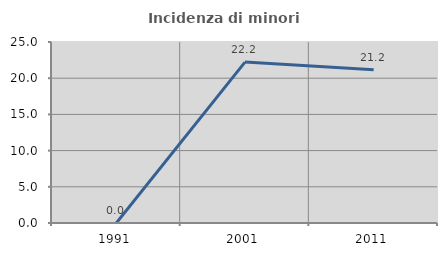
| Category | Incidenza di minori stranieri |
|---|---|
| 1991.0 | 0 |
| 2001.0 | 22.222 |
| 2011.0 | 21.154 |